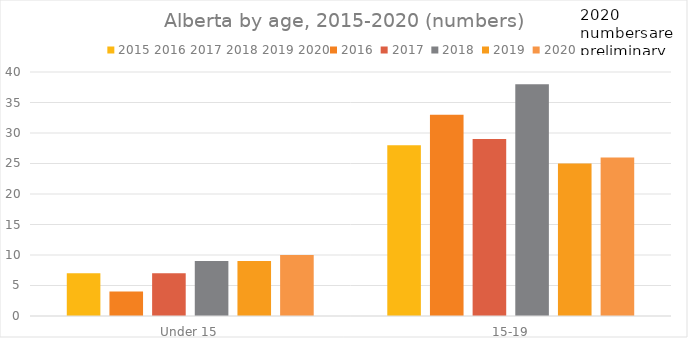
| Category | 2015 2016 2017 2018 2019 2020 | 2016 | 2017 | 2018 | 2019 | 2020 |
|---|---|---|---|---|---|---|
| Under 15 | 7 | 4 | 7 | 9 | 9 | 10 |
| 15-19 | 28 | 33 | 29 | 38 | 25 | 26 |